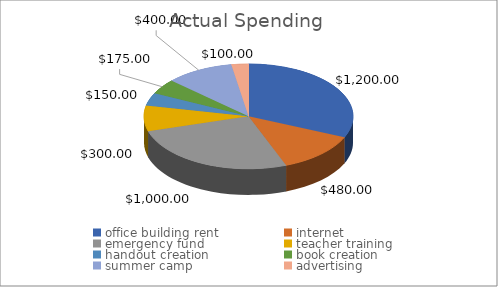
| Category | Series 1 | Series 0 |
|---|---|---|
| office building rent | 1200 | 1200 |
| internet | 480 | 480 |
| emergency fund | 1000 | 1000 |
| teacher training | 300 | 300 |
| handout creation | 150 | 150 |
| book creation | 175 | 175 |
| summer camp | 400 | 400 |
| advertising | 100 | 100 |